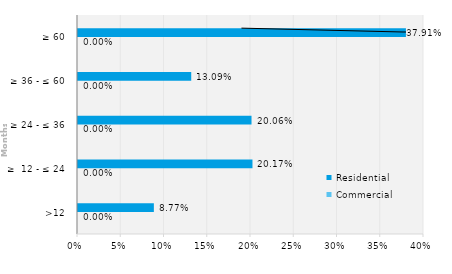
| Category | Commercial | Residential |
|---|---|---|
| >12 | 0 | 0.088 |
| ≥  12 - ≤ 24 | 0 | 0.202 |
| ≥ 24 - ≤ 36 | 0 | 0.201 |
| ≥ 36 - ≤ 60 | 0 | 0.131 |
| ≥ 60 | 0 | 0.379 |